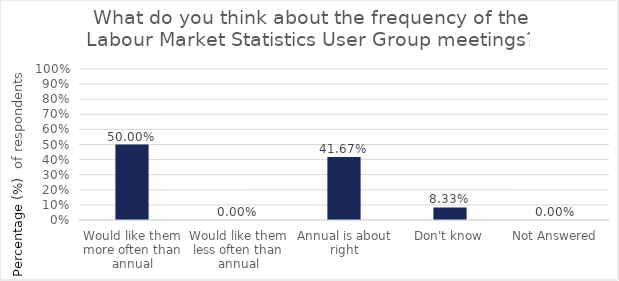
| Category | Series 0 |
|---|---|
| Would like them more often than annual | 0.5 |
| Would like them less often than annual | 0 |
| Annual is about right | 0.417 |
| Don't know | 0.083 |
| Not Answered | 0 |